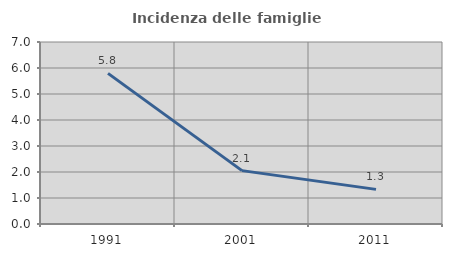
| Category | Incidenza delle famiglie numerose |
|---|---|
| 1991.0 | 5.793 |
| 2001.0 | 2.053 |
| 2011.0 | 1.331 |